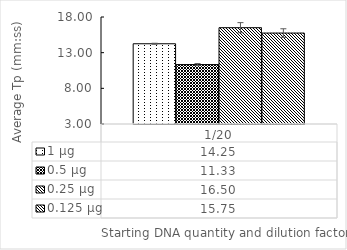
| Category | 1 µg | 0.5 µg | 0.25 µg | 0.125 µg |
|---|---|---|---|---|
| 1/20 | 14.25 | 11.33 | 16.5 | 15.75 |